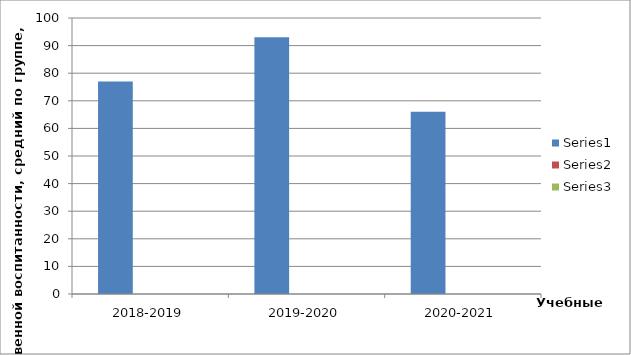
| Category | Series 0 | Series 1 | Series 2 |
|---|---|---|---|
| 2018-2019 | 77 |  |  |
| 2019-2020 | 93 |  |  |
| 2020-2021 | 66 |  |  |